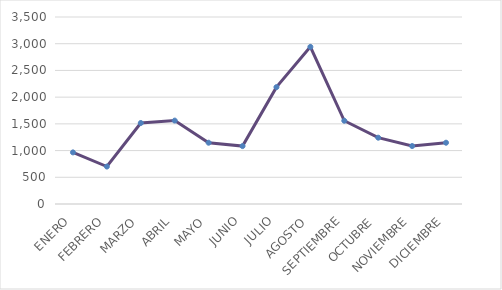
| Category | Series 0 |
|---|---|
| ENERO | 966 |
| FEBRERO | 701 |
| MARZO | 1516 |
| ABRIL | 1561 |
| MAYO | 1147 |
| JUNIO | 1084 |
| JULIO | 2187 |
| AGOSTO | 2941 |
| SEPTIEMBRE | 1558 |
| OCTUBRE | 1241 |
| NOVIEMBRE | 1085 |
| DICIEMBRE | 1147 |